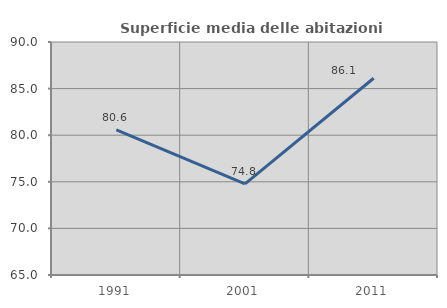
| Category | Superficie media delle abitazioni occupate |
|---|---|
| 1991.0 | 80.569 |
| 2001.0 | 74.77 |
| 2011.0 | 86.112 |